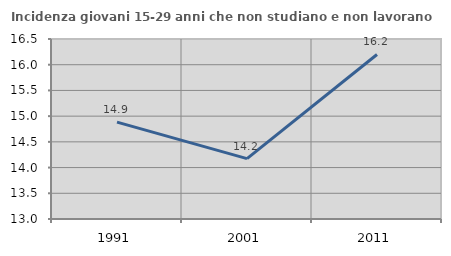
| Category | Incidenza giovani 15-29 anni che non studiano e non lavorano  |
|---|---|
| 1991.0 | 14.883 |
| 2001.0 | 14.174 |
| 2011.0 | 16.199 |